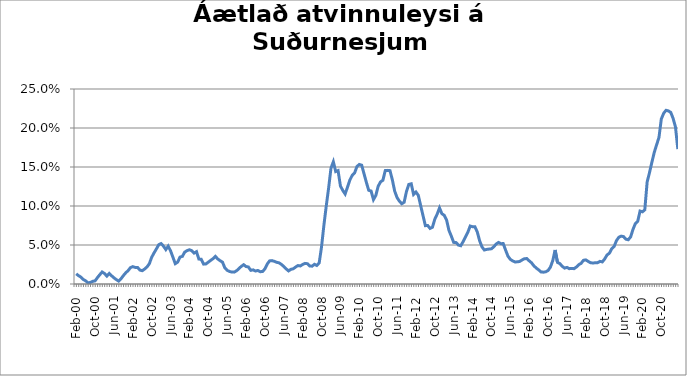
| Category | Series 0 |
|---|---|
| feb.00 | 0.013 |
| mar.00 | 0.011 |
| apr.00 | 0.009 |
| maí.00 | 0.006 |
| jún.00 | 0.004 |
| júl.00 | 0.002 |
| ágú.00 | 0.002 |
| sep.00 | 0.003 |
| okt.00 | 0.004 |
| nóv.00 | 0.008 |
| des.00 | 0.012 |
| jan.01 | 0.015 |
| feb.01 | 0.013 |
| mar.01 | 0.01 |
| apr.01 | 0.013 |
| maí.01 | 0.011 |
| jún.01 | 0.008 |
| júl.01 | 0.006 |
| ágú.01 | 0.004 |
| sep.01 | 0.007 |
| okt.01 | 0.011 |
| nóv.01 | 0.014 |
| des.01 | 0.017 |
| jan.02 | 0.021 |
| feb.02 | 0.022 |
| mar.02 | 0.021 |
| apr.02 | 0.021 |
| maí.02 | 0.018 |
| jún.02 | 0.017 |
| júl.02 | 0.019 |
| ágú.02 | 0.022 |
| sep.02 | 0.026 |
| okt.02 | 0.034 |
| nóv.02 | 0.04 |
| des.02 | 0.045 |
| jan.03 | 0.05 |
| feb.03 | 0.052 |
| mar.03 | 0.049 |
| apr.03 | 0.044 |
| maí.03 | 0.049 |
| jún.03 | 0.043 |
| júl.03 | 0.034 |
| ágú.03 | 0.026 |
| sep.03 | 0.028 |
| okt.03 | 0.034 |
| nóv.03 | 0.035 |
| des.03 | 0.041 |
| jan.04 | 0.043 |
| feb.04 | 0.044 |
| mar.04 | 0.043 |
| apr.04 | 0.04 |
| maí.04 | 0.041 |
| jún.04 | 0.032 |
| júl.04 | 0.032 |
| ágú.04 | 0.026 |
| sep.04 | 0.026 |
| okt.04 | 0.028 |
| nóv.04 | 0.03 |
| des.04 | 0.032 |
| jan.05 | 0.035 |
| feb.05 | 0.032 |
| mar.05 | 0.03 |
| apr.05 | 0.028 |
| maí.05 | 0.021 |
| jún.05 | 0.018 |
| júl.05 | 0.016 |
| ágú.05 | 0.015 |
| sep.05 | 0.015 |
| okt.05 | 0.017 |
| nóv.05 | 0.02 |
| des.05 | 0.023 |
| jan.06 | 0.025 |
| feb.06 | 0.022 |
| mar.06 | 0.022 |
| apr.06 | 0.018 |
| maí.06 | 0.018 |
| jún.06 | 0.017 |
| júl.06 | 0.017 |
| ágú.06 | 0.016 |
| sep.06 | 0.016 |
| okt.06 | 0.019 |
| nóv.06 | 0.026 |
| des.06 | 0.03 |
| jan.07 | 0.03 |
| feb.07 | 0.029 |
| mar.07 | 0.028 |
| apr.07 | 0.027 |
| maí.07 | 0.025 |
| jún.07 | 0.022 |
| júl.07 | 0.019 |
| ágú.07 | 0.017 |
| sep.07 | 0.019 |
| okt.07 | 0.02 |
| nóv.07 | 0.022 |
| des.07 | 0.024 |
| jan.08 | 0.023 |
| feb.08 | 0.025 |
| mar.08 | 0.026 |
| apr.08 | 0.026 |
| maí.08 | 0.023 |
| jún.08 | 0.023 |
| júl.08 | 0.025 |
| ágú.08 | 0.024 |
| sep.08 | 0.027 |
| okt.08 | 0.048 |
| nóv.08 | 0.075 |
| des.08 | 0.1 |
| jan.09 | 0.123 |
| feb.09 | 0.149 |
| mar.09 | 0.157 |
| apr.09 | 0.144 |
| maí.09 | 0.145 |
| jún.09 | 0.126 |
| júl.09 | 0.12 |
| ágú.09 | 0.115 |
| sep.09 | 0.124 |
| okt.09 | 0.133 |
| nóv.09 | 0.139 |
| des.09 | 0.142 |
| jan.10 | 0.151 |
| feb.10 | 0.153 |
| mar.10 | 0.152 |
| apr.10 | 0.141 |
| maí.10 | 0.13 |
| jún.10 | 0.12 |
| júl.10 | 0.119 |
| ágú.10 | 0.108 |
| sep.10 | 0.114 |
| okt.10 | 0.125 |
| nóv.10 | 0.131 |
| des.10 | 0.133 |
| jan.11 | 0.145 |
| feb.11 | 0.146 |
| mar.11 | 0.145 |
| apr.11 | 0.134 |
| maí.11 | 0.119 |
| jún.11 | 0.111 |
| júl.11 | 0.106 |
| ágú.11 | 0.103 |
| sep.11 | 0.105 |
| okt.11 | 0.119 |
| nóv.11 | 0.128 |
| des.11 | 0.128 |
| jan.12 | 0.115 |
| feb.12 | 0.118 |
| mar.12 | 0.114 |
| apr.12 | 0.101 |
| maí.12 | 0.088 |
| jún.12 | 0.075 |
| júl.12 | 0.075 |
| ágú.12 | 0.071 |
| sep.12 | 0.073 |
| okt.12 | 0.083 |
| nóv.12 | 0.09 |
| des.12 | 0.098 |
| jan.13 | 0.09 |
| feb.13 | 0.088 |
| mar.13 | 0.082 |
| apr.13 | 0.069 |
| maí.13 | 0.061 |
| jún.13 | 0.053 |
| júl.13 | 0.053 |
| ágú.13 | 0.05 |
| sep.13 | 0.049 |
| okt.13 | 0.054 |
| nóv.13 | 0.06 |
| des.13 | 0.066 |
| jan.14 | 0.074 |
| feb.14 | 0.073 |
| mar.14 | 0.073 |
| apr.14 | 0.067 |
| maí.14 | 0.055 |
| jún.14 | 0.048 |
| júl.14 | 0.044 |
| ágú.14 | 0.044 |
| sep.14 | 0.045 |
| okt.14 | 0.045 |
| nóv.14*** | 0.048 |
| des.14 | 0.051 |
| jan.15 | 0.053 |
| feb.15 | 0.052 |
| mar.15 | 0.052 |
| apr.15 | 0.044 |
| maí.15 | 0.036 |
| jún.15 | 0.032 |
| júl.15 | 0.03 |
| ágú.15 | 0.028 |
| sep.15 | 0.028 |
| okt.15 | 0.029 |
| nóv.15 | 0.031 |
| des.15 | 0.032 |
| jan.16 | 0.033 |
| feb.16 | 0.03 |
| mar.16 | 0.027 |
| apr.16 | 0.023 |
| maí.16 | 0.02 |
| jún.16 | 0.018 |
| júl.16 | 0.015 |
| ágú.16 | 0.015 |
| sep.16 | 0.016 |
| okt.16 | 0.017 |
| nóv.16 | 0.022 |
| des.16 | 0.03 |
| jan.17 | 0.044 |
| feb.17 | 0.028 |
| mar.17 | 0.026 |
| apr.17 | 0.023 |
| maí.17 | 0.02 |
| jún.17 | 0.021 |
| júl.17 | 0.02 |
| ágú.17 | 0.02 |
| sep.17 | 0.02 |
| okt.17 | 0.022 |
| nóv.17 | 0.025 |
| des.17 | 0.026 |
| jan.18 | 0.03 |
| feb.18 | 0.031 |
| mar.18 | 0.029 |
| apr.18 | 0.027 |
| maí.18 | 0.027 |
| jún.18 | 0.027 |
| júl.18 | 0.027 |
| ágú.18 | 0.029 |
| sep.18 | 0.028 |
| okt.18 | 0.032 |
| nóv.18 | 0.037 |
| des.18 | 0.039 |
| jan.19 | 0.045 |
| feb.19 | 0.048 |
| mar.19 | 0.056 |
| apr.19 | 0.06 |
| maí.19 | 0.061 |
| jún.19 | 0.061 |
| júl.19 | 0.057 |
| ágú.19 | 0.057 |
| sep.19 | 0.06 |
| okt.19 | 0.07 |
| nóv.19 | 0.078 |
| des.19 | 0.08 |
| jan.20 | 0.094 |
| feb.20 | 0.093 |
| mars 2020* | 0.095 |
| apr.20 | 0.131 |
| maí.20 | 0.143 |
| jún.20 | 0.156 |
| júl.20 | 0.169 |
| ágú.20 | 0.178 |
| sep.20 | 0.188 |
| okt.20 | 0.212 |
| nóv.20 | 0.219 |
| des.20 | 0.223 |
| jan.21 | 0.222 |
| feb.21 | 0.22 |
| mar.21 | 0.212 |
| apr.21 | 0.201 |
| maí.21 | 0.173 |